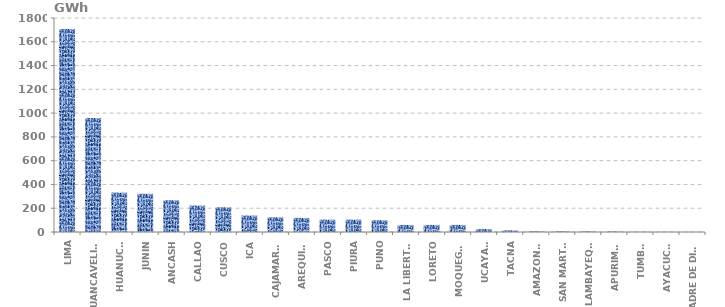
| Category | Series 0 |
|---|---|
| LIMA | 1707.315 |
| HUANCAVELICA | 959.249 |
| HUANUCO | 331.287 |
| JUNIN | 321.398 |
| ANCASH | 267.007 |
| CALLAO | 222.506 |
| CUSCO | 207.672 |
| ICA | 138.448 |
| CAJAMARCA | 123.615 |
| AREQUIPA | 118.67 |
| PASCO | 103.836 |
| PIURA | 103.836 |
| PUNO | 98.892 |
| LA LIBERTAD | 59.335 |
| LORETO | 59.335 |
| MOQUEGUA | 59.335 |
| UCAYALI | 24.723 |
| TACNA | 13.845 |
| AMAZONAS | 5.933 |
| SAN MARTÍN | 5.933 |
| LAMBAYEQUE | 5.439 |
| APURIMAC | 4.45 |
| TUMBES | 1.483 |
| AYACUCHO | 0.89 |
| MADRE DE DIOS | 0.148 |